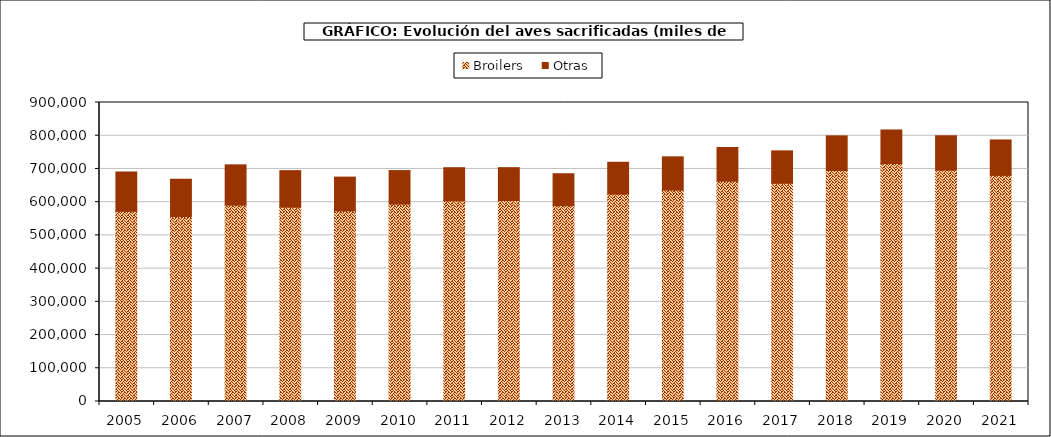
| Category | Broilers | Otras |
|---|---|---|
| 2005.0 | 572648.744 | 118205.781 |
| 2006.0 | 556861.129 | 112149.283 |
| 2007.0 | 591393.726 | 120913.02 |
| 2008.0 | 584815.145 | 110075.473 |
| 2009.0 | 573771.704 | 101674.561 |
| 2010.0 | 594157.627 | 100908.152 |
| 2011.0 | 603746.997 | 99980.393 |
| 2012.0 | 604962.301 | 98903.042 |
| 2013.0 | 589666.337 | 95872.2 |
| 2014.0 | 624364.078 | 95729.779 |
| 2015.0 | 636311.721 | 100143.279 |
| 2016.0 | 663376.013 | 101162.185 |
| 2017.0 | 656846.042 | 97537.585 |
| 2018.0 | 695196.199 | 104409.425 |
| 2019.0 | 716259.103 | 101061.758 |
| 2020.0 | 696386.914 | 103461.4 |
| 2021.0 | 680711.012 | 106601.504 |